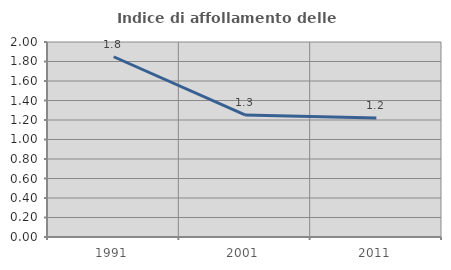
| Category | Indice di affollamento delle abitazioni  |
|---|---|
| 1991.0 | 1.849 |
| 2001.0 | 1.252 |
| 2011.0 | 1.22 |